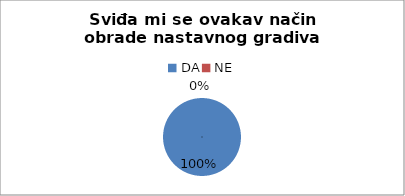
| Category | Series 0 |
|---|---|
| DA | 22 |
| NE | 0 |